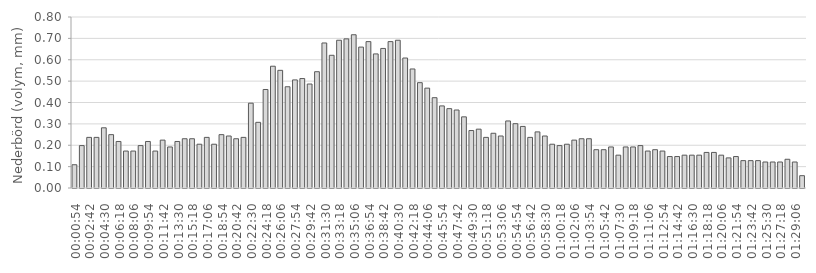
| Category | Nederbörd (volym, mm) |
|---|---|
|  00:00:54  | 0.109 |
|  00:01:48  | 0.198 |
|  00:02:42  | 0.237 |
|  00:03:36  | 0.237 |
|  00:04:30  | 0.282 |
|  00:05:24  | 0.25 |
|  00:06:18  | 0.218 |
|  00:07:12  | 0.173 |
|  00:08:06  | 0.173 |
|  00:09:00  | 0.198 |
|  00:09:54  | 0.218 |
|  00:10:48  | 0.173 |
|  00:11:42  | 0.224 |
|  00:12:36  | 0.192 |
|  00:13:30  | 0.218 |
|  00:14:24  | 0.23 |
|  00:15:18  | 0.23 |
|  00:16:12  | 0.205 |
|  00:17:06  | 0.237 |
|  00:18:00  | 0.205 |
|  00:18:54  | 0.25 |
|  00:19:48  | 0.243 |
|  00:20:42  | 0.23 |
|  00:21:36  | 0.237 |
|  00:22:30  | 0.397 |
|  00:23:24  | 0.307 |
|  00:24:18  | 0.461 |
|  00:25:12  | 0.57 |
|  00:26:06  | 0.55 |
|  00:27:00  | 0.474 |
|  00:27:54  | 0.506 |
|  00:28:48  | 0.512 |
|  00:29:42  | 0.486 |
|  00:30:36  | 0.544 |
|  00:31:30  | 0.678 |
|  00:32:24  | 0.621 |
|  00:33:18  | 0.691 |
|  00:34:12  | 0.698 |
|  00:35:06  | 0.717 |
|  00:36:00  | 0.659 |
|  00:36:54  | 0.685 |
|  00:37:48  | 0.627 |
|  00:38:42  | 0.653 |
|  00:39:36  | 0.685 |
|  00:40:30  | 0.691 |
|  00:41:24  | 0.608 |
|  00:42:18  | 0.557 |
|  00:43:12  | 0.493 |
|  00:44:06  | 0.467 |
|  00:45:00  | 0.422 |
|  00:45:54  | 0.384 |
|  00:46:48  | 0.371 |
|  00:47:42  | 0.365 |
|  00:48:36  | 0.333 |
|  00:49:30  | 0.269 |
|  00:50:24  | 0.275 |
|  00:51:18  | 0.237 |
|  00:52:12  | 0.256 |
|  00:53:06  | 0.243 |
|  00:54:00  | 0.314 |
|  00:54:54  | 0.301 |
|  00:55:48  | 0.288 |
|  00:56:42  | 0.237 |
|  00:57:36  | 0.262 |
|  00:58:30  | 0.243 |
|  00:59:24  | 0.205 |
|  01:00:18  | 0.198 |
|  01:01:12  | 0.205 |
|  01:02:06  | 0.224 |
|  01:03:00  | 0.23 |
|  01:03:54  | 0.23 |
|  01:04:48  | 0.179 |
|  01:05:42  | 0.179 |
|  01:06:36  | 0.192 |
|  01:07:30  | 0.154 |
|  01:08:24  | 0.192 |
|  01:09:18  | 0.192 |
|  01:10:12  | 0.198 |
|  01:11:06  | 0.173 |
|  01:12:00  | 0.179 |
|  01:12:54  | 0.173 |
|  01:13:48  | 0.147 |
|  01:14:42  | 0.147 |
|  01:15:36  | 0.154 |
|  01:16:30  | 0.154 |
|  01:17:24  | 0.154 |
|  01:18:18  | 0.166 |
|  01:19:12  | 0.166 |
|  01:20:06  | 0.154 |
|  01:21:00  | 0.141 |
|  01:21:54  | 0.147 |
|  01:22:48  | 0.128 |
|  01:23:42  | 0.128 |
|  01:24:36  | 0.128 |
|  01:25:30  | 0.122 |
|  01:26:24  | 0.122 |
|  01:27:18  | 0.122 |
|  01:28:12  | 0.134 |
|  01:29:06  | 0.122 |
|  01:30:00  | 0.058 |